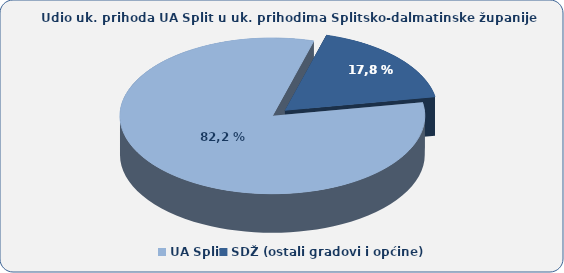
| Category | 82,2 17,8 |
|---|---|
| UA Split | 82.154 |
| SDŽ (ostali gradovi i općine) | 17.846 |